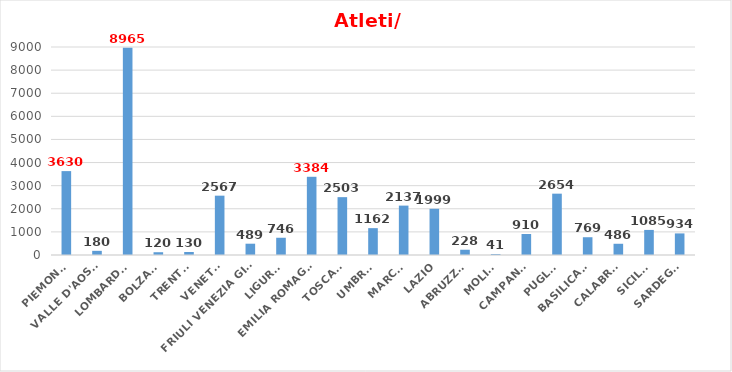
| Category | Series 0 |
|---|---|
| PIEMONTE | 3630 |
| VALLE D'AOSTA | 180 |
| LOMBARDIA | 8965 |
| BOLZANO | 120 |
| TRENTO | 130 |
| VENETO | 2567 |
| FRIULI VENEZIA GIULIA | 489 |
| LIGURIA | 746 |
| EMILIA ROMAGNA | 3384 |
| TOSCANA | 2503 |
| UMBRIA | 1162 |
| MARCHE | 2137 |
| LAZIO | 1999 |
| ABRUZZO | 228 |
| MOLISE | 41 |
| CAMPANIA | 910 |
| PUGLIA | 2654 |
| BASILICATA | 769 |
| CALABRIA | 486 |
| SICILIA | 1085 |
| SARDEGNA | 934 |